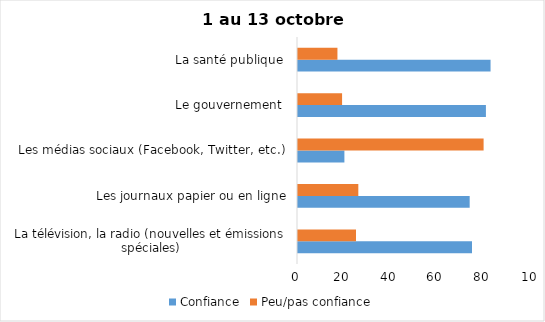
| Category | Confiance | Peu/pas confiance |
|---|---|---|
| La télévision, la radio (nouvelles et émissions spéciales) | 75 | 25 |
| Les journaux papier ou en ligne | 74 | 26 |
| Les médias sociaux (Facebook, Twitter, etc.) | 20 | 80 |
| Le gouvernement  | 81 | 19 |
| La santé publique  | 83 | 17 |